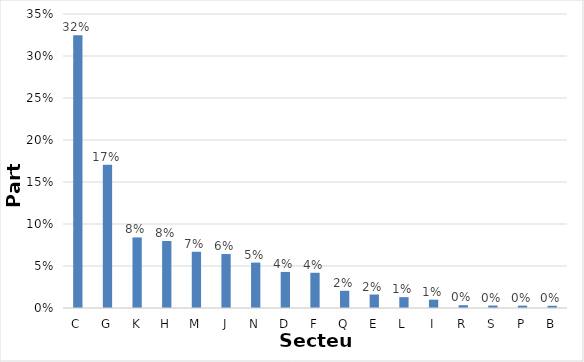
| Category | part |
|---|---|
| C | 0.325 |
| G | 0.17 |
| K | 0.084 |
| H | 0.08 |
| M | 0.067 |
| J | 0.064 |
| N | 0.054 |
| D | 0.043 |
| F | 0.042 |
| Q | 0.02 |
| E | 0.016 |
| L | 0.013 |
| I | 0.01 |
| R | 0.003 |
| S | 0.003 |
| P | 0.003 |
| B | 0.003 |